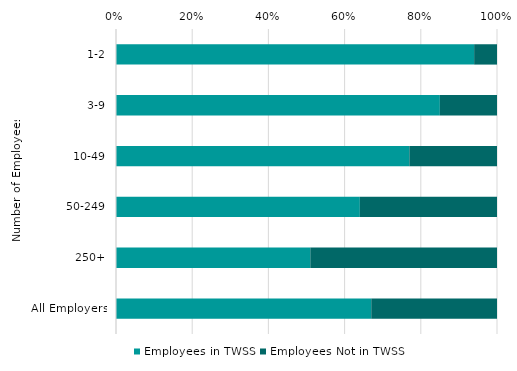
| Category | Employees in TWSS | Employees Not in TWSS |
|---|---|---|
| 1-2 | 0.94 | 0.06 |
| 3-9 | 0.85 | 0.15 |
| 10-49 | 0.77 | 0.23 |
| 50-249 | 0.64 | 0.36 |
| 250+ | 0.51 | 0.49 |
| All Employers | 0.67 | 0.33 |